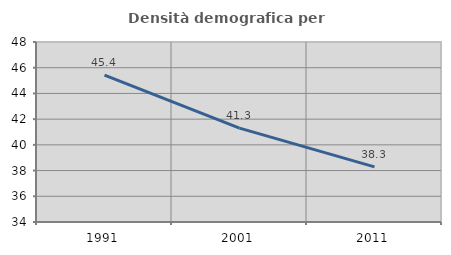
| Category | Densità demografica |
|---|---|
| 1991.0 | 45.429 |
| 2001.0 | 41.299 |
| 2011.0 | 38.291 |